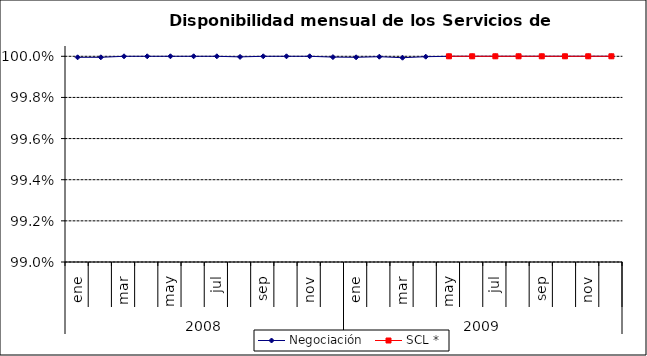
| Category | Negociación | SCL * |
|---|---|---|
| 0 | 1 | 0 |
| 1 | 1 | 0 |
| 2 | 1 | 0 |
| 3 | 1 | 0 |
| 4 | 1 | 0 |
| 5 | 1 | 0 |
| 6 | 1 | 0 |
| 7 | 1 | 0 |
| 8 | 1 | 0 |
| 9 | 1 | 0 |
| 10 | 1 | 0 |
| 11 | 1 | 0 |
| 12 | 1 | 0 |
| 13 | 1 | 0 |
| 14 | 1 | 0 |
| 15 | 1 | 0 |
| 16 | 1 | 1 |
| 17 | 1 | 1 |
| 18 | 1 | 1 |
| 19 | 1 | 1 |
| 20 | 1 | 1 |
| 21 | 1 | 1 |
| 22 | 1 | 1 |
| 23 | 1 | 1 |